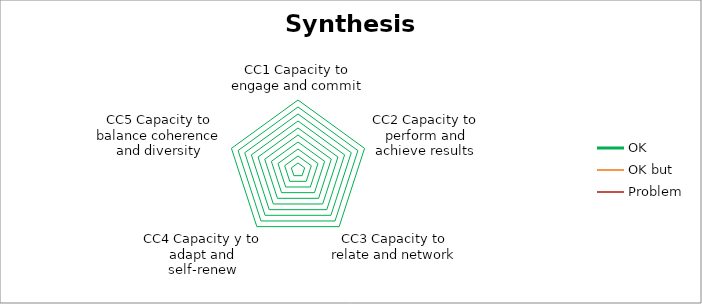
| Category | OK | OK but | Problem |
|---|---|---|---|
| CC1 Capacity to engage and commit | 0 | 0 | 0 |
| CC2 Capacity to perform and achieve results | 0 | 0 | 0 |
| CC3 Capacity to relate and network | 0 | 0 | 0 |
| CC4 Capacity y to adapt and self-renew | 0 | 0 | 0 |
| CC5 Capacity to balance coherence and diversity | 0 | 0 | 0 |